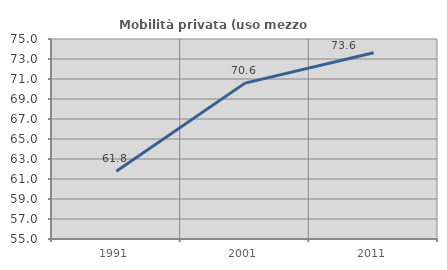
| Category | Mobilità privata (uso mezzo privato) |
|---|---|
| 1991.0 | 61.778 |
| 2001.0 | 70.588 |
| 2011.0 | 73.617 |